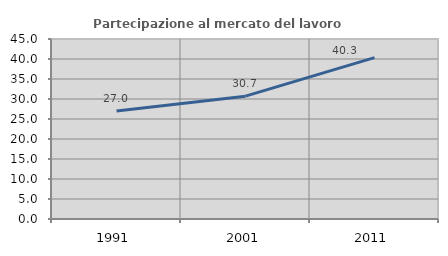
| Category | Partecipazione al mercato del lavoro  femminile |
|---|---|
| 1991.0 | 26.997 |
| 2001.0 | 30.711 |
| 2011.0 | 40.338 |